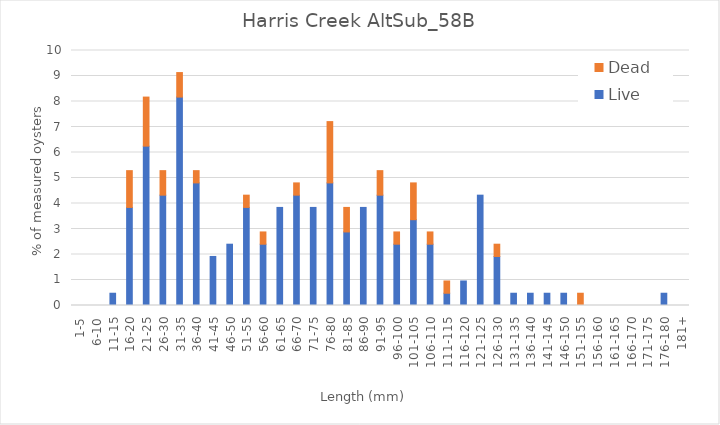
| Category | Live | Dead |
|---|---|---|
| 1-5 | 0 | 0 |
| 6-10 | 0 | 0 |
| 11-15 | 0.481 | 0 |
| 16-20 | 3.846 | 1.442 |
| 21-25 | 6.25 | 1.923 |
| 26-30 | 4.327 | 0.962 |
| 31-35 | 8.173 | 0.962 |
| 36-40 | 4.808 | 0.481 |
| 41-45 | 1.923 | 0 |
| 46-50 | 2.404 | 0 |
| 51-55 | 3.846 | 0.481 |
| 56-60 | 2.404 | 0.481 |
| 61-65 | 3.846 | 0 |
| 66-70 | 4.327 | 0.481 |
| 71-75 | 3.846 | 0 |
| 76-80 | 4.808 | 2.404 |
| 81-85 | 2.885 | 0.962 |
| 86-90 | 3.846 | 0 |
| 91-95 | 4.327 | 0.962 |
| 96-100 | 2.404 | 0.481 |
| 101-105 | 3.365 | 1.442 |
| 106-110 | 2.404 | 0.481 |
| 111-115 | 0.481 | 0.481 |
| 116-120 | 0.962 | 0 |
| 121-125 | 4.327 | 0 |
| 126-130 | 1.923 | 0.481 |
| 131-135 | 0.481 | 0 |
| 136-140 | 0.481 | 0 |
| 141-145 | 0.481 | 0 |
| 146-150 | 0.481 | 0 |
| 151-155 | 0 | 0.481 |
| 156-160 | 0 | 0 |
| 161-165 | 0 | 0 |
| 166-170 | 0 | 0 |
| 171-175 | 0 | 0 |
| 176-180 | 0.481 | 0 |
| 181+ | 0 | 0 |